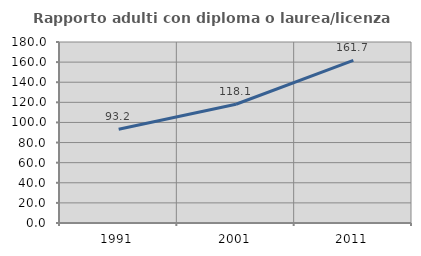
| Category | Rapporto adulti con diploma o laurea/licenza media  |
|---|---|
| 1991.0 | 93.222 |
| 2001.0 | 118.098 |
| 2011.0 | 161.711 |